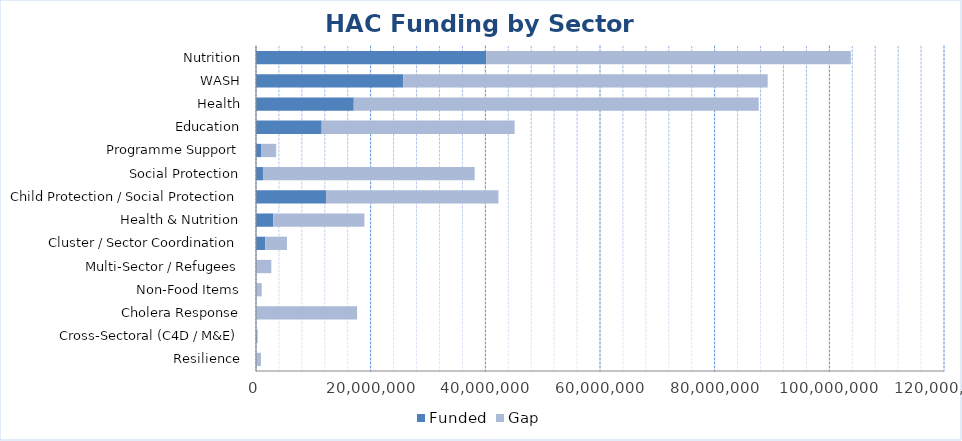
| Category | Funded | Gap |
|---|---|---|
| Resilience | 0 | 860000 |
| Cross-Sectoral (C4D / M&E) | 102944 | 197056 |
| Cholera Response | 0 | 17630680 |
| Non-Food Items | 0 | 1000000 |
| Multi-Sector / Refugees | 0 | 2675290 |
| Cluster / Sector Coordination | 1607718 | 3803282 |
| Health & Nutrition | 3016016 | 15888984 |
| Child Protection / Social Protection | 12205263 | 30082293 |
| Social Protection | 1214196 | 36920174 |
| Programme Support | 882256 | 2637744 |
| Education | 11454789 | 33657591 |
| Health | 17050336 | 70629036 |
| WASH | 25689273 | 63561068 |
| Nutrition | 40141845 | 63608788 |